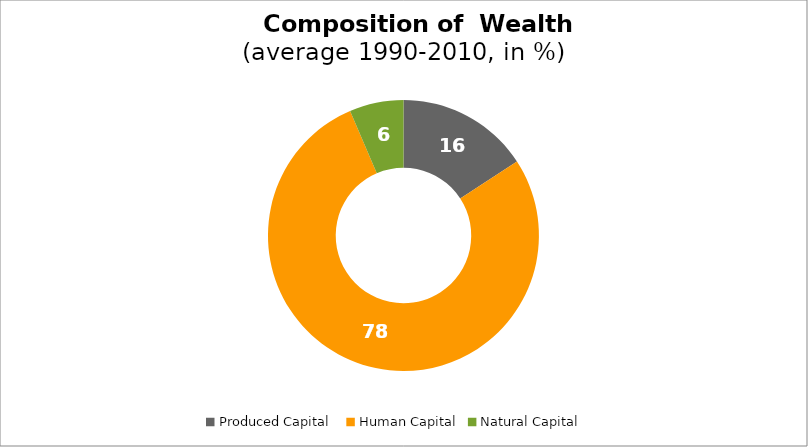
| Category | Series 0 |
|---|---|
| Produced Capital  | 15.795 |
| Human Capital | 77.757 |
| Natural Capital | 6.447 |